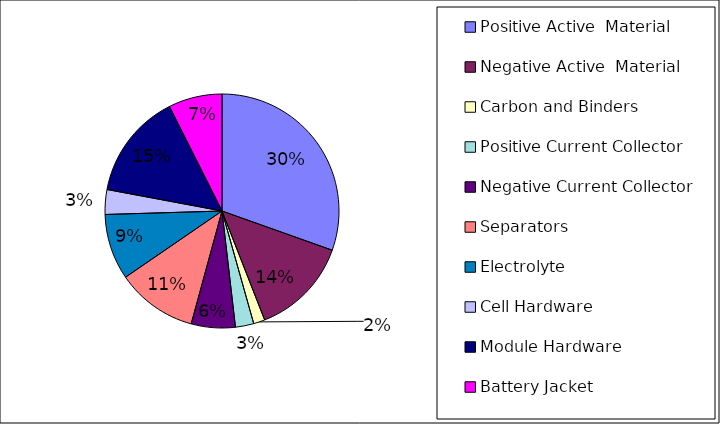
| Category | Series 0 |
|---|---|
| Positive Active  Material | 850.991 |
| Negative Active  Material | 380.781 |
| Carbon and Binders | 43.855 |
| Positive Current Collector | 70.782 |
| Negative Current Collector | 169.97 |
| Separators | 312.771 |
| Electrolyte | 254.265 |
| Cell Hardware | 95.552 |
| Module Hardware | 409.526 |
| Battery Jacket | 207.212 |